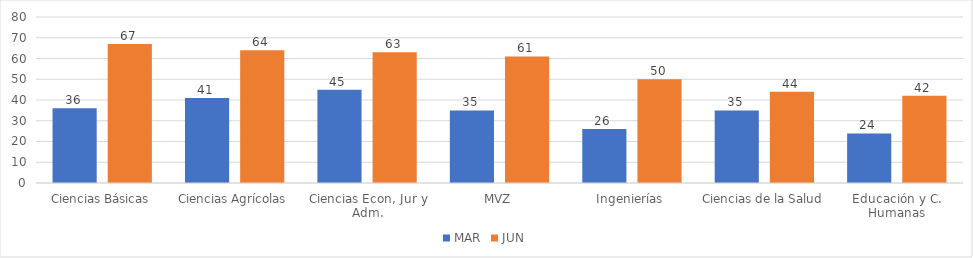
| Category | MAR | JUN |
|---|---|---|
| Ciencias Básicas | 36 | 67 |
| Ciencias Agrícolas | 41 | 64 |
| Ciencias Econ, Jur y Adm. | 45 | 63 |
| MVZ | 35 | 61 |
| Ingenierías | 26 | 50 |
| Ciencias de la Salud | 35 | 44 |
| Educación y C. Humanas | 23.9 | 42 |